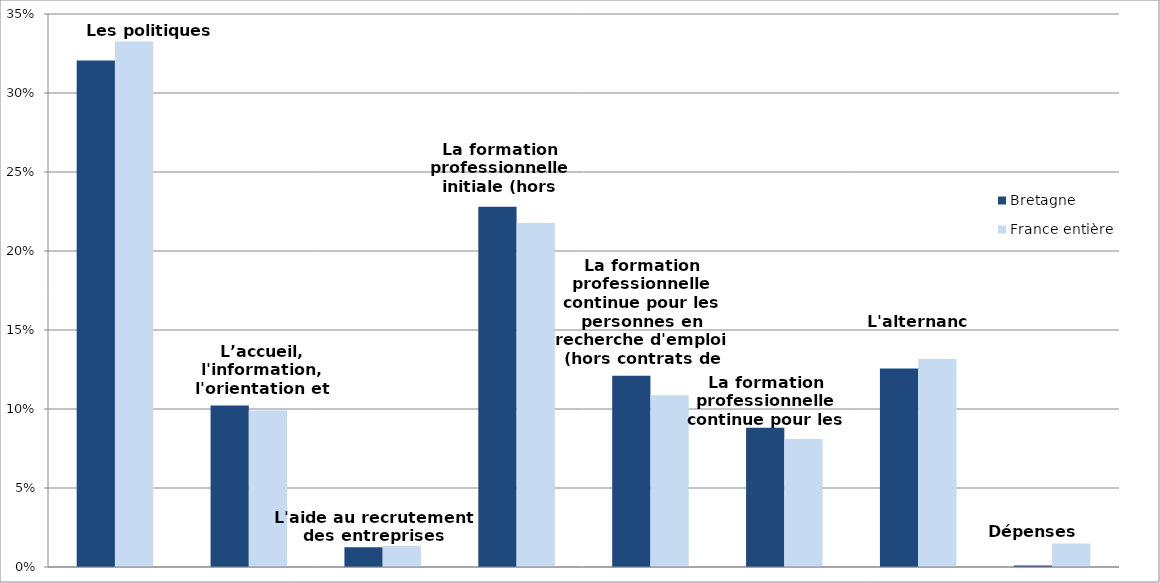
| Category | Bretagne | France entière |
|---|---|---|
| Les politiques d'emploi | 0.321 | 0.333 |
| L’accueil, l'information, l'orientation et l'accompagnement | 0.102 | 0.099 |
| L'aide au recrutement des entreprises | 0.013 | 0.013 |
| La formation professionnelle initiale (hors apprentissage) | 0.228 | 0.218 |
| La formation professionnelle continue pour les personnes en recherche d'emploi (hors contrats de professionnalisation) | 0.121 | 0.109 |
| La formation professionnelle continue pour les actifs occupés | 0.088 | 0.081 |
| L'alternance | 0.126 | 0.132 |
| Dépenses non-ventilables | 0.001 | 0.015 |